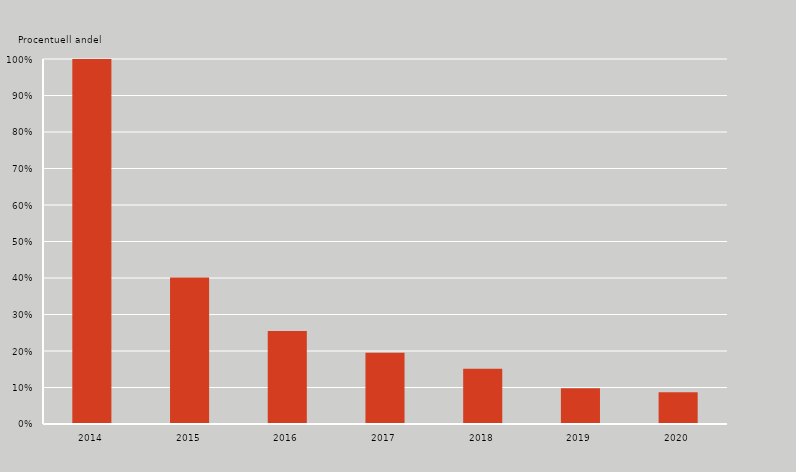
| Category | Series 0 |
|---|---|
| 2014.0 | 1 |
| 2015.0 | 0.401 |
| 2016.0 | 0.255 |
| 2017.0 | 0.195 |
| 2018.0 | 0.151 |
| 2019.0 | 0.098 |
| 2020.0 | 0.087 |